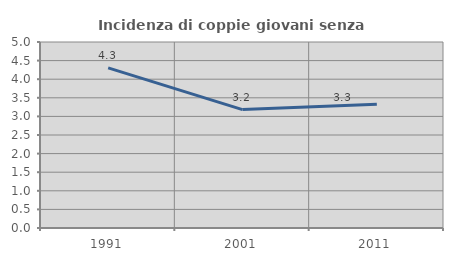
| Category | Incidenza di coppie giovani senza figli |
|---|---|
| 1991.0 | 4.306 |
| 2001.0 | 3.183 |
| 2011.0 | 3.327 |